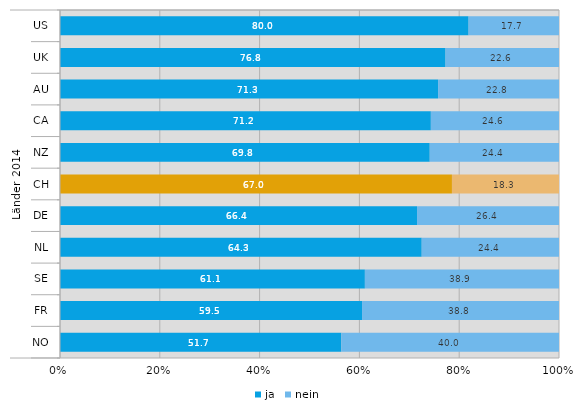
| Category | ja | nein |
|---|---|---|
| 0 | 80 | 17.7 |
| 1 | 76.8 | 22.6 |
| 2 | 71.3 | 22.8 |
| 3 | 71.2 | 24.6 |
| 4 | 69.8 | 24.4 |
| 5 | 67 | 18.3 |
| 6 | 66.4 | 26.4 |
| 7 | 64.3 | 24.4 |
| 8 | 61.1 | 38.9 |
| 9 | 59.5 | 38.8 |
| 10 | 51.7 | 40 |